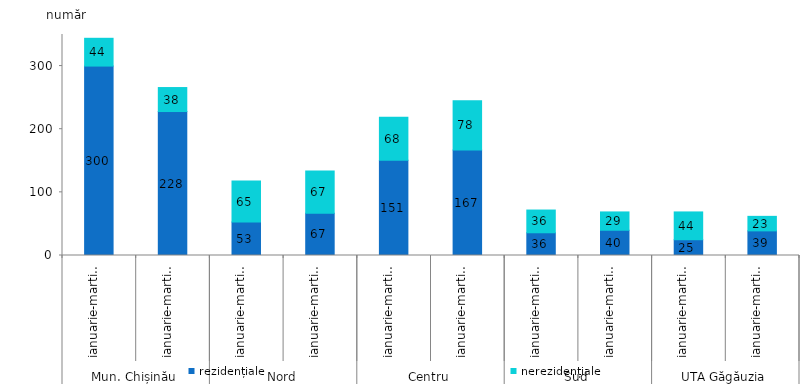
| Category | rezidențiale | nerezidențiale |
|---|---|---|
| 0 | 300 | 44 |
| 1 | 228 | 38 |
| 2 | 53 | 65 |
| 3 | 67 | 67 |
| 4 | 151 | 68 |
| 5 | 167 | 78 |
| 6 | 36 | 36 |
| 7 | 40 | 29 |
| 8 | 25 | 44 |
| 9 | 39 | 23 |